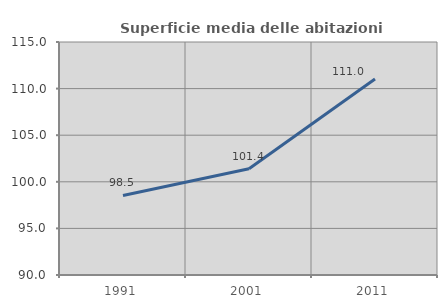
| Category | Superficie media delle abitazioni occupate |
|---|---|
| 1991.0 | 98.538 |
| 2001.0 | 101.401 |
| 2011.0 | 111.027 |